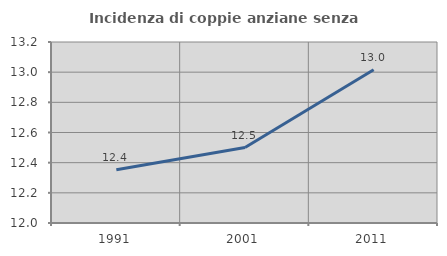
| Category | Incidenza di coppie anziane senza figli  |
|---|---|
| 1991.0 | 12.353 |
| 2001.0 | 12.5 |
| 2011.0 | 13.016 |